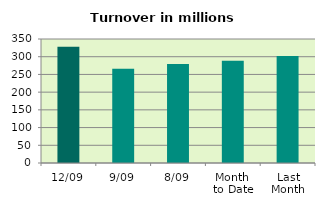
| Category | Series 0 |
|---|---|
| 12/09 | 328.195 |
| 9/09 | 265.757 |
| 8/09 | 279.629 |
| Month 
to Date | 288.87 |
| Last
Month | 301.741 |